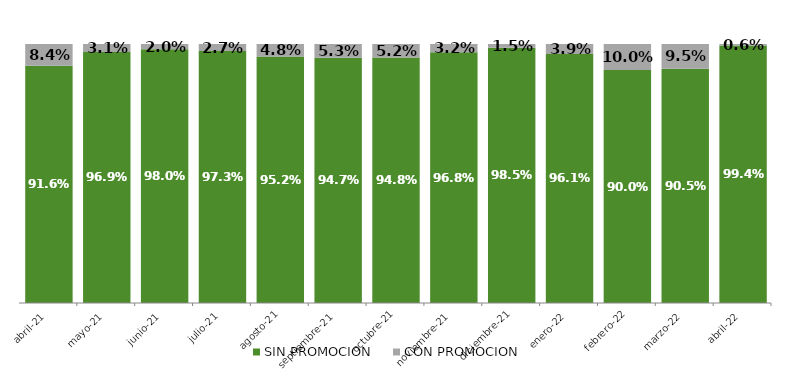
| Category | SIN PROMOCION   | CON PROMOCION   |
|---|---|---|
| 2021-04-01 | 0.916 | 0.084 |
| 2021-05-01 | 0.969 | 0.031 |
| 2021-06-01 | 0.98 | 0.02 |
| 2021-07-01 | 0.973 | 0.027 |
| 2021-08-01 | 0.952 | 0.048 |
| 2021-09-01 | 0.947 | 0.053 |
| 2021-10-01 | 0.948 | 0.052 |
| 2021-11-01 | 0.968 | 0.032 |
| 2021-12-01 | 0.985 | 0.015 |
| 2022-01-01 | 0.961 | 0.039 |
| 2022-02-01 | 0.9 | 0.1 |
| 2022-03-01 | 0.905 | 0.095 |
| 2022-04-01 | 0.994 | 0.006 |